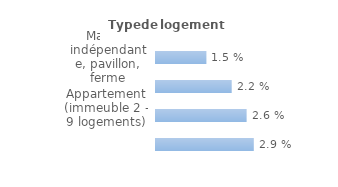
| Category | Series 0 |
|---|---|
| Maison indépendante, pavillon, ferme | 0.015 |
| Maison de ville groupée | 0.022 |
| Appartement (immeuble 2 - 9 logements) | 0.026 |
| Appartement (immeuble de 10 logements ou +) | 0.029 |